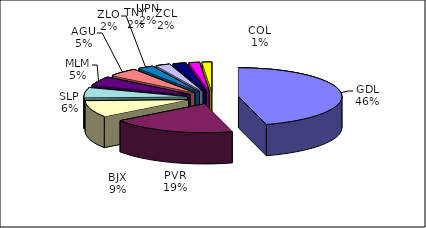
| Category | Series 0 |
|---|---|
| GDL | 160278 |
| PVR | 68455 |
| BJX | 32699 |
| SLP | 19747 |
| MLM | 18249 |
| AGU | 16623 |
| ZLO | 8773 |
| TNY | 7928 |
| ZCL | 7288 |
| UPN | 5797 |
| COL | 5224 |